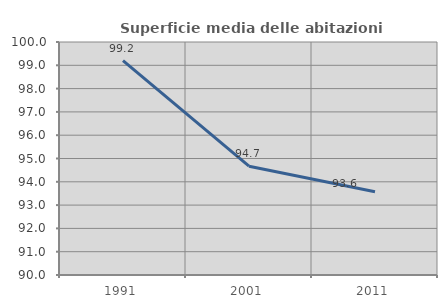
| Category | Superficie media delle abitazioni occupate |
|---|---|
| 1991.0 | 99.201 |
| 2001.0 | 94.67 |
| 2011.0 | 93.571 |